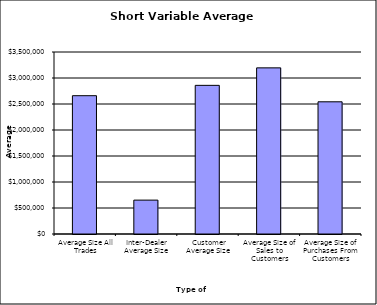
| Category | Security Type |
|---|---|
| Average Size All Trades | 2659590.965 |
| Inter-Dealer Average Size | 651667.415 |
| Customer Average Size | 2858763.674 |
| Average Size of Sales to Customers | 3194965.377 |
| Average Size of Purchases From Customers | 2542338.542 |